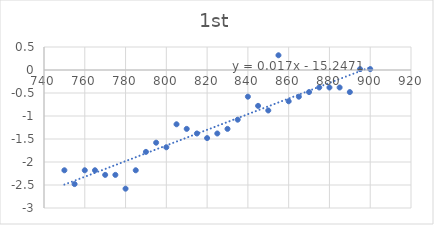
| Category | Series 0 |
|---|---|
| 750.0 | -2.18 |
| 755.0 | -2.48 |
| 760.0 | -2.18 |
| 765.0 | -2.18 |
| 770.0 | -2.28 |
| 775.0 | -2.28 |
| 780.0 | -2.58 |
| 785.0 | -2.18 |
| 790.0 | -1.78 |
| 795.0 | -1.58 |
| 800.0 | -1.68 |
| 805.0 | -1.18 |
| 810.0 | -1.28 |
| 815.0 | -1.38 |
| 820.0 | -1.48 |
| 825.0 | -1.38 |
| 830.0 | -1.28 |
| 835.0 | -1.08 |
| 840.0 | -0.58 |
| 845.0 | -0.78 |
| 850.0 | -0.88 |
| 855.0 | 0.32 |
| 860.0 | -0.68 |
| 865.0 | -0.58 |
| 870.0 | -0.48 |
| 875.0 | -0.38 |
| 880.0 | -0.38 |
| 885.0 | -0.38 |
| 890.0 | -0.48 |
| 895.0 | 0.02 |
| 900.0 | 0.02 |